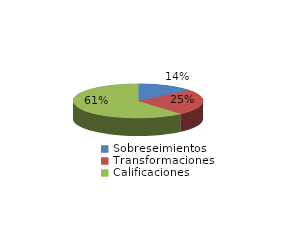
| Category | Series 0 |
|---|---|
| Sobreseimientos | 3063 |
| Transformaciones | 5403 |
| Calificaciones | 13366 |